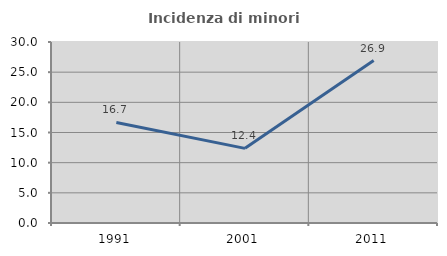
| Category | Incidenza di minori stranieri |
|---|---|
| 1991.0 | 16.667 |
| 2001.0 | 12.371 |
| 2011.0 | 26.923 |